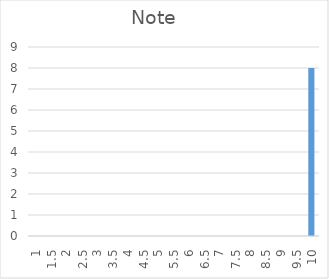
| Category | Series 0 |
|---|---|
| 1.0 | 0 |
| 1.5 | 0 |
| 2.0 | 0 |
| 2.5 | 0 |
| 3.0 | 0 |
| 3.5 | 0 |
| 4.0 | 0 |
| 4.5 | 0 |
| 5.0 | 0 |
| 5.5 | 0 |
| 6.0 | 0 |
| 6.5 | 0 |
| 7.0 | 0 |
| 7.5 | 0 |
| 8.0 | 0 |
| 8.5 | 0 |
| 9.0 | 0 |
| 9.5 | 0 |
| 10.0 | 8 |